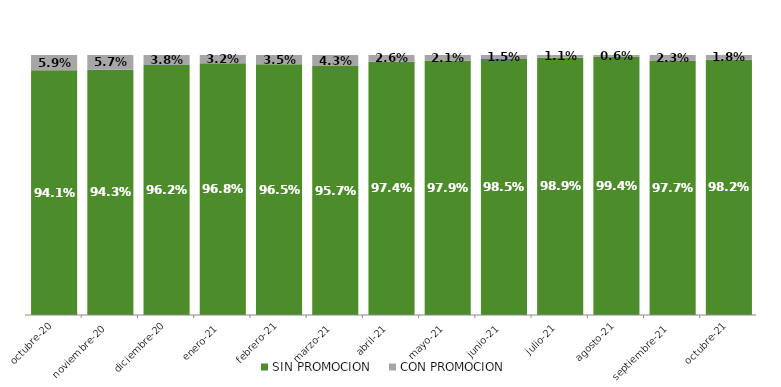
| Category | SIN PROMOCION   | CON PROMOCION   |
|---|---|---|
| 2020-10-01 | 0.941 | 0.059 |
| 2020-11-01 | 0.943 | 0.057 |
| 2020-12-01 | 0.962 | 0.038 |
| 2021-01-01 | 0.968 | 0.032 |
| 2021-02-01 | 0.965 | 0.035 |
| 2021-03-01 | 0.957 | 0.043 |
| 2021-04-01 | 0.974 | 0.026 |
| 2021-05-01 | 0.979 | 0.021 |
| 2021-06-01 | 0.985 | 0.015 |
| 2021-07-01 | 0.989 | 0.011 |
| 2021-08-01 | 0.994 | 0.006 |
| 2021-09-01 | 0.977 | 0.023 |
| 2021-10-01 | 0.982 | 0.018 |